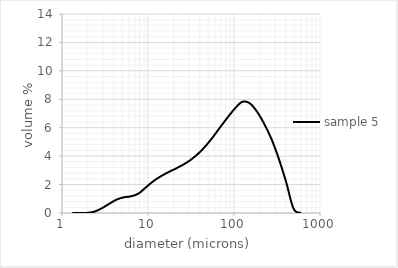
| Category | sample 5 |
|---|---|
| 1.32 | 0 |
| 1.6 | 0 |
| 1.95 | 0.007 |
| 2.38 | 0.096 |
| 2.9 | 0.329 |
| 3.53 | 0.643 |
| 4.3 | 0.94 |
| 5.24 | 1.106 |
| 6.39 | 1.177 |
| 7.78 | 1.373 |
| 9.48 | 1.811 |
| 11.55 | 2.239 |
| 14.08 | 2.582 |
| 17.15 | 2.865 |
| 20.9 | 3.117 |
| 25.46 | 3.389 |
| 31.01 | 3.716 |
| 37.79 | 4.137 |
| 46.03 | 4.665 |
| 56.09 | 5.295 |
| 68.33 | 5.995 |
| 83.26 | 6.682 |
| 101.44 | 7.32 |
| 123.59 | 7.812 |
| 150.57001 | 7.743 |
| 183.44 | 7.167 |
| 223.50999 | 6.295 |
| 272.31 | 5.212 |
| 331.76999 | 3.819 |
| 404.20999 | 2.167 |
| 492.47 | 0.303 |
| 600.0 | 0 |